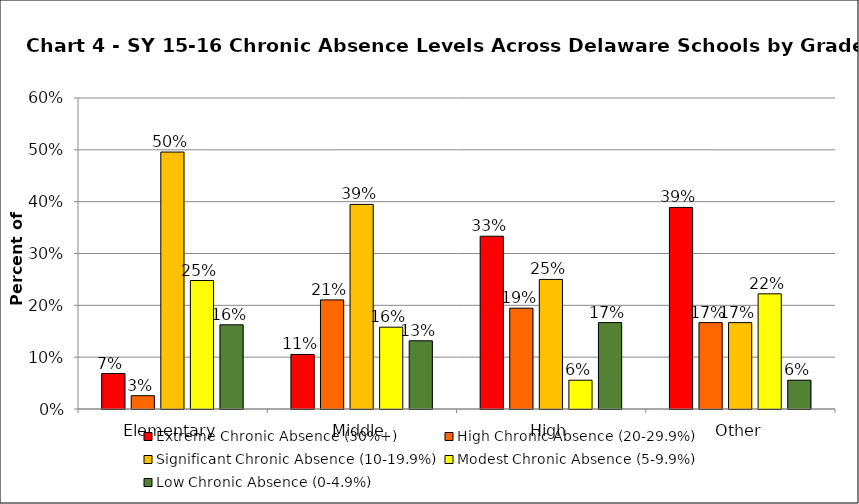
| Category | Extreme Chronic Absence (30%+) | High Chronic Absence (20-29.9%) | Significant Chronic Absence (10-19.9%) | Modest Chronic Absence (5-9.9%) | Low Chronic Absence (0-4.9%) |
|---|---|---|---|---|---|
| 0 | 0.068 | 0.026 | 0.496 | 0.248 | 0.162 |
| 1 | 0.105 | 0.211 | 0.395 | 0.158 | 0.132 |
| 2 | 0.333 | 0.194 | 0.25 | 0.056 | 0.167 |
| 3 | 0.389 | 0.167 | 0.167 | 0.222 | 0.056 |